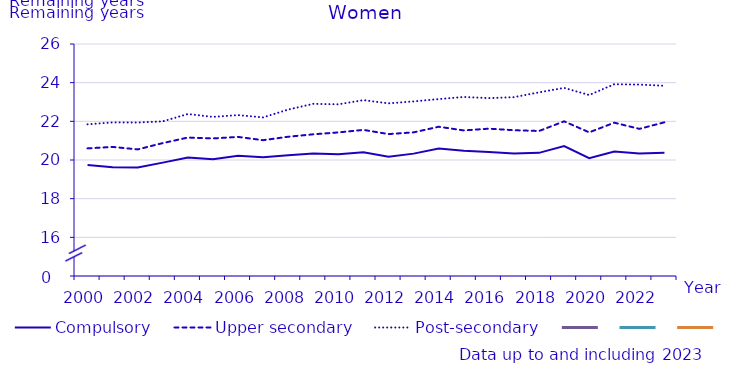
| Category | Compulsory | Upper secondary | Post-secondary | #REFERENS! |
|---|---|---|---|---|
| 2000.0 | 19.737 | 20.601 | 21.846 | 0 |
| 2001.0 | 19.624 | 20.677 | 21.944 | 0 |
| 2002.0 | 19.609 | 20.548 | 21.939 | 0 |
| 2003.0 | 19.865 | 20.875 | 21.999 | 0 |
| 2004.0 | 20.123 | 21.162 | 22.379 | 0 |
| 2005.0 | 20.042 | 21.115 | 22.229 | 0 |
| 2006.0 | 20.22 | 21.194 | 22.322 | 0 |
| 2007.0 | 20.147 | 21.025 | 22.203 | 0 |
| 2008.0 | 20.24 | 21.203 | 22.608 | 0 |
| 2009.0 | 20.336 | 21.329 | 22.906 | 0 |
| 2010.0 | 20.295 | 21.427 | 22.88 | 0 |
| 2011.0 | 20.401 | 21.557 | 23.097 | 0 |
| 2012.0 | 20.17 | 21.34 | 22.93 | 0 |
| 2013.0 | 20.33 | 21.43 | 23.03 | 0 |
| 2014.0 | 20.59 | 21.72 | 23.15 | 0 |
| 2015.0 | 20.48 | 21.53 | 23.26 | 0 |
| 2016.0 | 20.41 | 21.62 | 23.2 | 0 |
| 2017.0 | 20.34 | 21.54 | 23.25 | 0 |
| 2018.0 | 20.37 | 21.5 | 23.5 | 0 |
| 2019.0 | 20.72 | 22 | 23.73 | 0 |
| 2020.0 | 20.09 | 21.43 | 23.36 | 0 |
| 2021.0 | 20.44 | 21.93 | 23.92 | 0 |
| 2022.0 | 20.33 | 21.61 | 23.9 | 0 |
| 2023.0 | 20.38 | 21.95 | 23.84 | 0 |